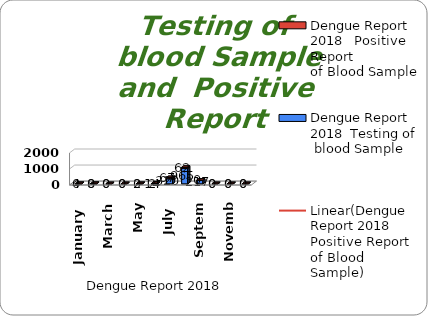
| Category | Dengue Report 2018  |
|---|---|
| January  | 0 |
| February  | 0 |
| March | 0 |
| April  | 0 |
| May | 0 |
| June | 2 |
| July  | 67 |
| August  | 62 |
| September | 0 |
| October | 0 |
| November | 0 |
| December  | 0 |